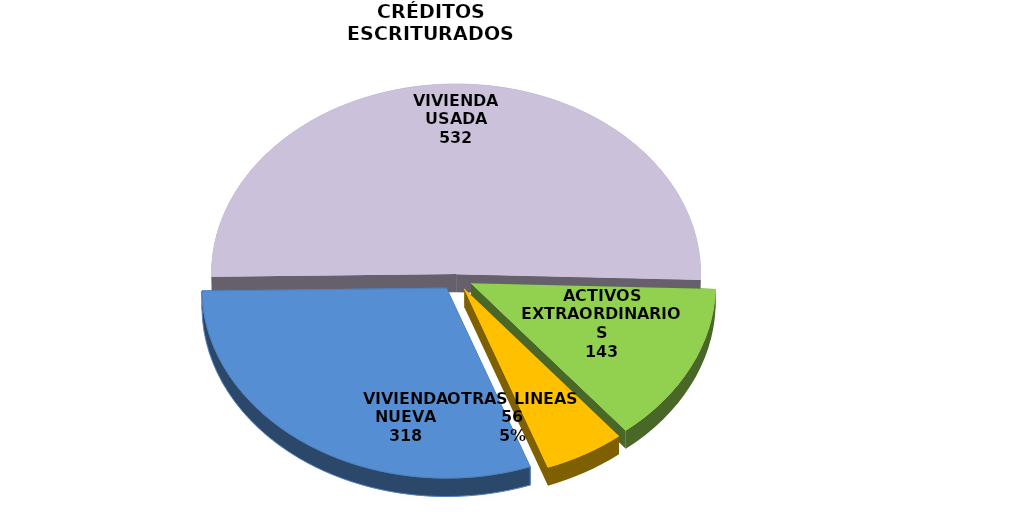
| Category | Series 0 |
|---|---|
| VIVIENDA NUEVA | 318 |
| VIVIENDA USADA | 532 |
| ACTIVOS EXTRAORDINARIOS | 143 |
| OTRAS LINEAS | 56 |